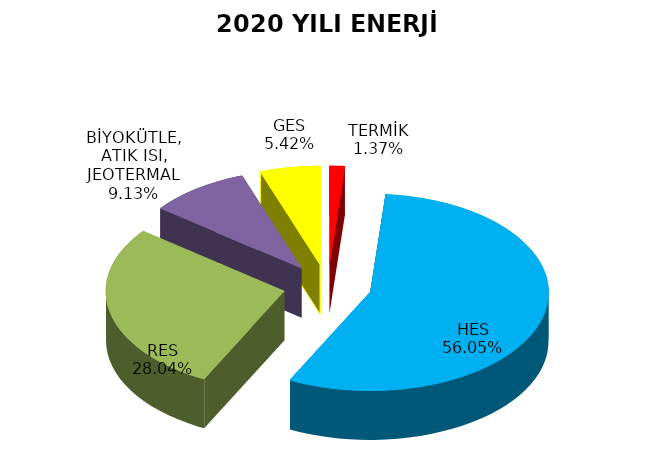
| Category | Series 0 |
|---|---|
| TERMİK | 60.804 |
| HES | 2483.629 |
| RES | 1242.34 |
| BİYOKÜTLE, ATIK ISI, JEOTERMAL | 404.458 |
| GES | 240.107 |